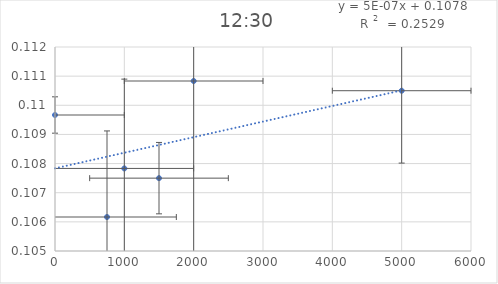
| Category | Series 0 |
|---|---|
| 750.0 | 0.106 |
| 1000.0 | 0.108 |
| 1500.0 | 0.108 |
| 2000.0 | 0.111 |
| 5000.0 | 0.11 |
| 0.0 | 0.11 |